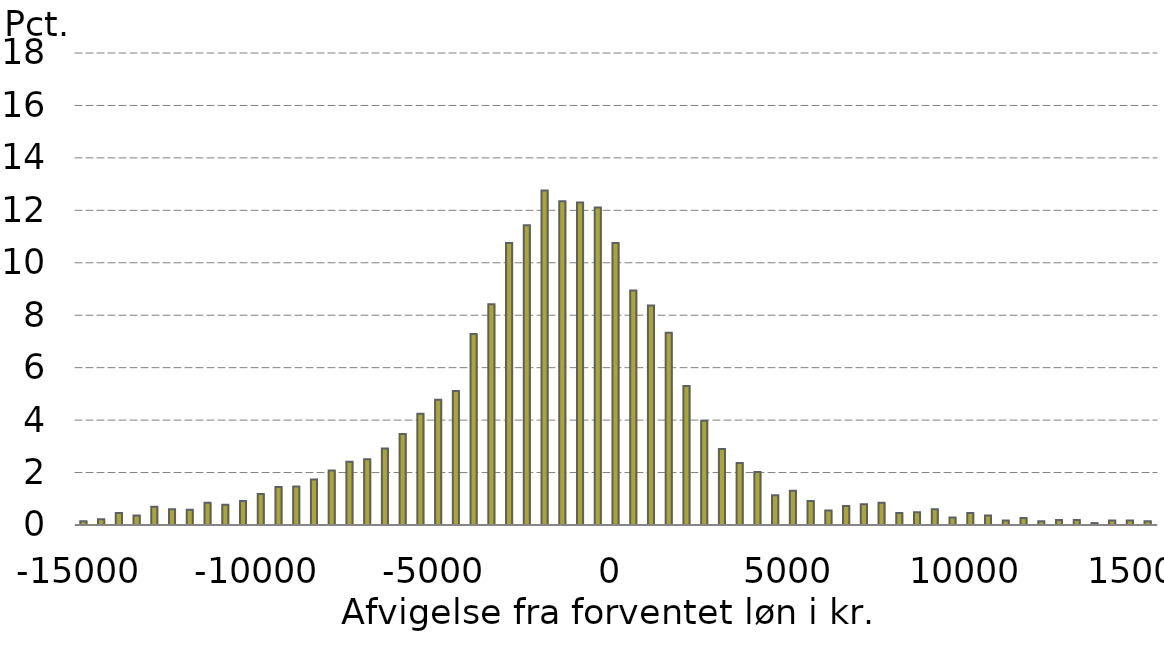
| Category |  Serie1 |
|---|---|
| -15000.0 | 0.145 |
| -14500.0 | 0.217 |
| -14000.0 | 0.458 |
| -13500.0 | 0.362 |
| -13000.0 | 0.699 |
| -12500.0 | 0.603 |
| -12000.0 | 0.579 |
| -11500.0 | 0.844 |
| -11000.0 | 0.772 |
| -10500.0 | 0.916 |
| -10000.0 | 1.182 |
| -9500.0 | 1.447 |
| -9000.0 | 1.471 |
| -8500.0 | 1.736 |
| -8000.0 | 2.074 |
| -7500.0 | 2.411 |
| -7000.0 | 2.508 |
| -6500.0 | 2.918 |
| -6000.0 | 3.472 |
| -5500.0 | 4.244 |
| -5000.0 | 4.775 |
| -4500.0 | 5.112 |
| -4000.0 | 7.282 |
| -3500.0 | 8.416 |
| -3000.0 | 10.755 |
| -2500.0 | 11.43 |
| -2000.0 | 12.756 |
| -1500.0 | 12.346 |
| -1000.0 | 12.298 |
| -500.0 | 12.105 |
| 0.0 | 10.755 |
| 500.0 | 8.946 |
| 1000.0 | 8.367 |
| 1500.0 | 7.331 |
| 2000.0 | 5.305 |
| 2500.0 | 3.979 |
| 3000.0 | 2.894 |
| 3500.0 | 2.363 |
| 4000.0 | 2.026 |
| 4500.0 | 1.133 |
| 5000.0 | 1.302 |
| 5500.0 | 0.916 |
| 6000.0 | 0.555 |
| 6500.0 | 0.723 |
| 7000.0 | 0.796 |
| 7500.0 | 0.844 |
| 8000.0 | 0.458 |
| 8500.0 | 0.482 |
| 9000.0 | 0.603 |
| 9500.0 | 0.289 |
| 10000.0 | 0.458 |
| 10500.0 | 0.362 |
| 11000.0 | 0.169 |
| 11500.0 | 0.265 |
| 12000.0 | 0.145 |
| 12500.0 | 0.193 |
| 13000.0 | 0.193 |
| 13500.0 | 0.072 |
| 14000.0 | 0.169 |
| 14500.0 | 0.169 |
| 15000.0 | 0.145 |